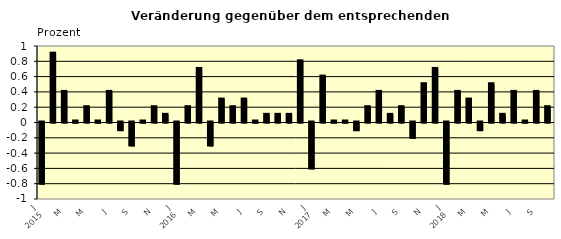
| Category | Series 0 |
|---|---|
| 0 | -0.8 |
| 1 | 0.9 |
| 2 | 0.4 |
| 3 | 0.01 |
| 4 | 0.2 |
| 5 | 0.01 |
| 6 | 0.4 |
| 7 | -0.1 |
| 8 | -0.3 |
| 9 | 0.01 |
| 10 | 0.2 |
| 11 | 0.1 |
| 12 | -0.8 |
| 13 | 0.2 |
| 14 | 0.7 |
| 15 | -0.3 |
| 16 | 0.3 |
| 17 | 0.2 |
| 18 | 0.3 |
| 19 | 0.01 |
| 20 | 0.1 |
| 21 | 0.1 |
| 22 | 0.1 |
| 23 | 0.8 |
| 24 | -0.6 |
| 25 | 0.6 |
| 26 | 0.01 |
| 27 | 0.01 |
| 28 | -0.1 |
| 29 | 0.2 |
| 30 | 0.4 |
| 31 | 0.1 |
| 32 | 0.2 |
| 33 | -0.2 |
| 34 | 0.5 |
| 35 | 0.7 |
| 36 | -0.8 |
| 37 | 0.4 |
| 38 | 0.3 |
| 39 | -0.1 |
| 40 | 0.5 |
| 41 | 0.1 |
| 42 | 0.4 |
| 43 | 0.01 |
| 44 | 0.4 |
| 45 | 0.2 |